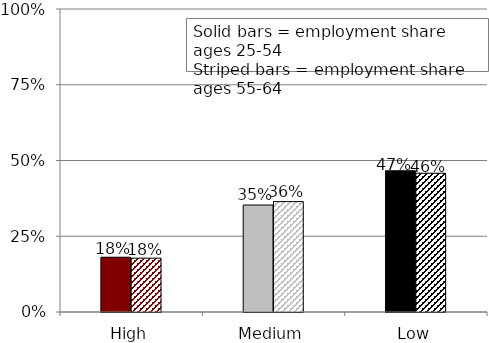
| Category | Ages 25-54 | Ages 55-64 |
|---|---|---|
| High | 0.181 | 0.178 |
| Medium | 0.353 | 0.364 |
| Low | 0.466 | 0.458 |